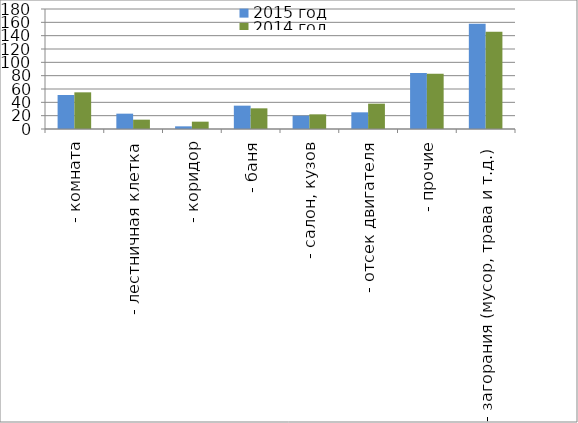
| Category | 2015 год | 2014 год |
|---|---|---|
|  - комната | 51 | 55 |
|  - лестничная клетка | 23 | 14 |
|  - коридор | 4 | 11 |
|  - баня | 35 | 31 |
|  - салон, кузов | 20 | 22 |
|  - отсек двигателя | 25 | 38 |
| - прочие | 84 | 83 |
| - загорания (мусор, трава и т.д.)  | 158 | 146 |